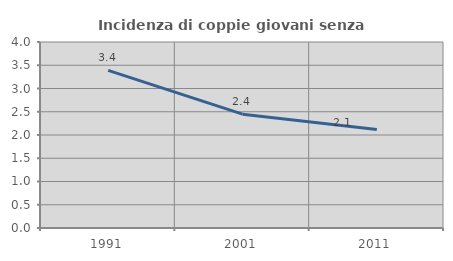
| Category | Incidenza di coppie giovani senza figli |
|---|---|
| 1991.0 | 3.39 |
| 2001.0 | 2.448 |
| 2011.0 | 2.119 |